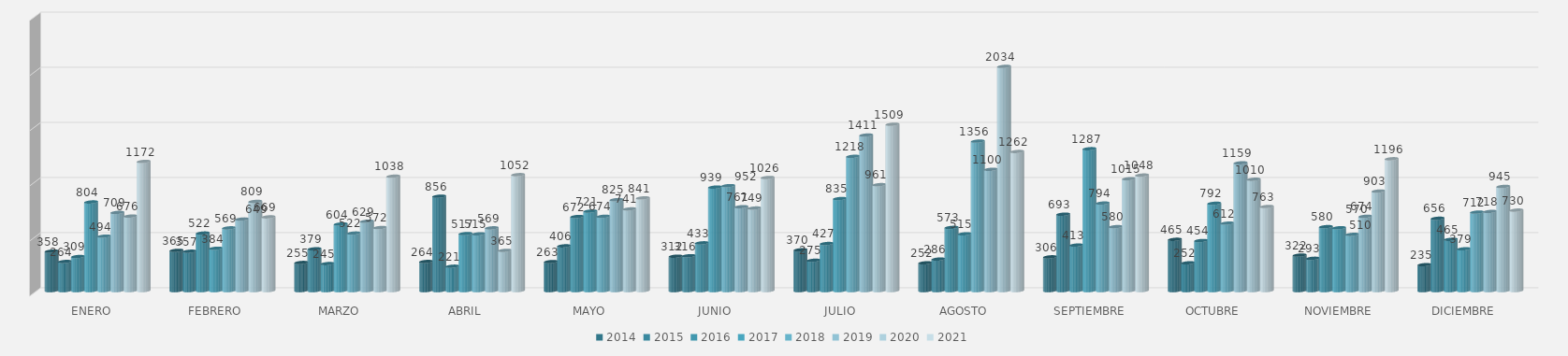
| Category | 2014 | 2015 | 2016 | 2017 | 2018 | 2019 | 2020 | 2021 |
|---|---|---|---|---|---|---|---|---|
| ENERO | 358 | 264 | 309 | 804 | 494 | 709 | 676 | 1172 |
| FEBRERO | 365 | 357 | 522 | 384 | 569 | 649 | 809 | 669 |
| MARZO | 255 | 379 | 245 | 604 | 522 | 629 | 572 | 1038 |
| ABRIL | 264 | 856 | 221 | 517 | 515 | 569 | 365 | 1052 |
| MAYO | 263 | 406 | 672 | 721 | 674 | 825 | 741 | 841 |
| JUNIO | 312 | 316 | 433 | 939 | 952 | 761 | 749 | 1026 |
| JULIO | 370 | 275 | 427 | 835 | 1218 | 1411 | 961 | 1509 |
| AGOSTO | 252 | 286 | 573 | 515 | 1356 | 1100 | 2034 | 1262 |
| SEPTIEMBRE | 306 | 693 | 413 | 1287 | 794 | 580 | 1015 | 1048 |
| OCTUBRE | 465 | 252 | 454 | 792 | 612 | 1159 | 1010 | 763 |
| NOVIEMBRE | 322 | 293 | 580 | 570 | 510 | 674 | 903 | 1196 |
| DICIEMBRE | 235 | 656 | 465 | 379 | 712 | 718 | 945 | 730 |